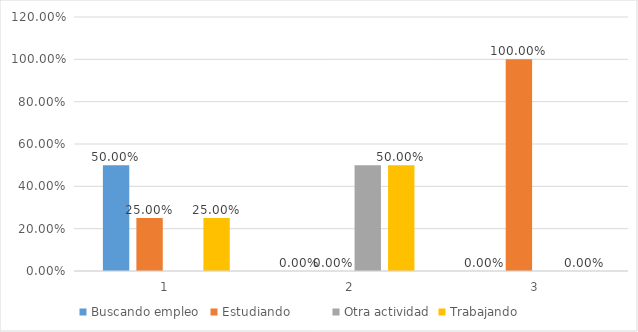
| Category | Buscando empleo  | Estudiando          | Otra actividad | Trabajando          |
|---|---|---|---|---|
| 0 | 0.5 | 0.25 | 0 | 0.25 |
| 1 | 0 | 0 | 0.5 | 0.5 |
| 2 | 0 | 1 | 0 | 0 |